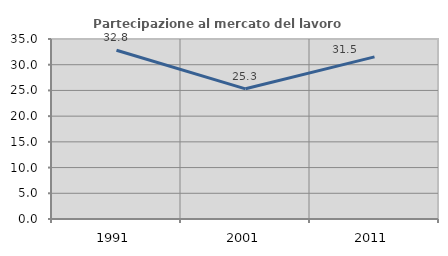
| Category | Partecipazione al mercato del lavoro  femminile |
|---|---|
| 1991.0 | 32.82 |
| 2001.0 | 25.313 |
| 2011.0 | 31.529 |